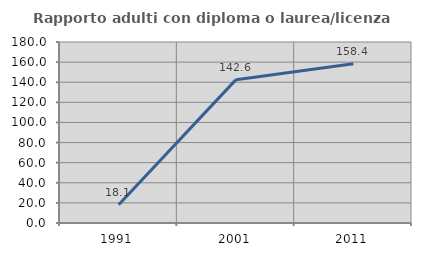
| Category | Rapporto adulti con diploma o laurea/licenza media  |
|---|---|
| 1991.0 | 18.064 |
| 2001.0 | 142.56 |
| 2011.0 | 158.44 |